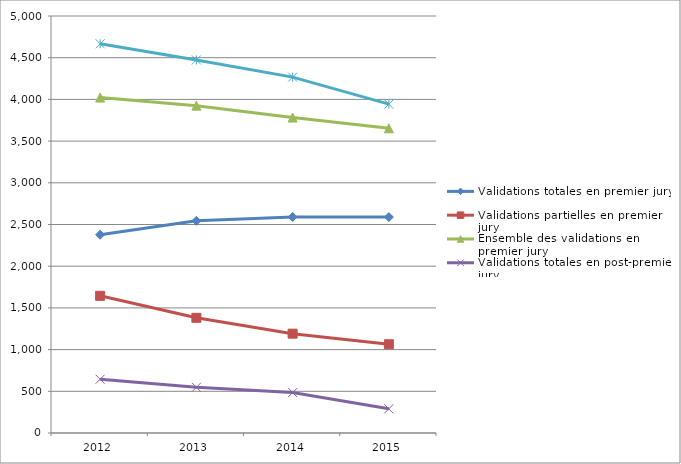
| Category | Validations totales en premier jury | Validations partielles en premier jury | Ensemble des validations en premier jury | Validations totales en post-premier jury | Ensemble des validations |
|---|---|---|---|---|---|
| 2012.0 | 2377 | 1645 | 4022 | 645 | 4667 |
| 2013.0 | 2544 | 1381 | 3925 | 548 | 4473 |
| 2014.0 | 2591 | 1191 | 3782 | 485 | 4267 |
| 2015.0 | 2589 | 1064 | 3653 | 290 | 3943 |